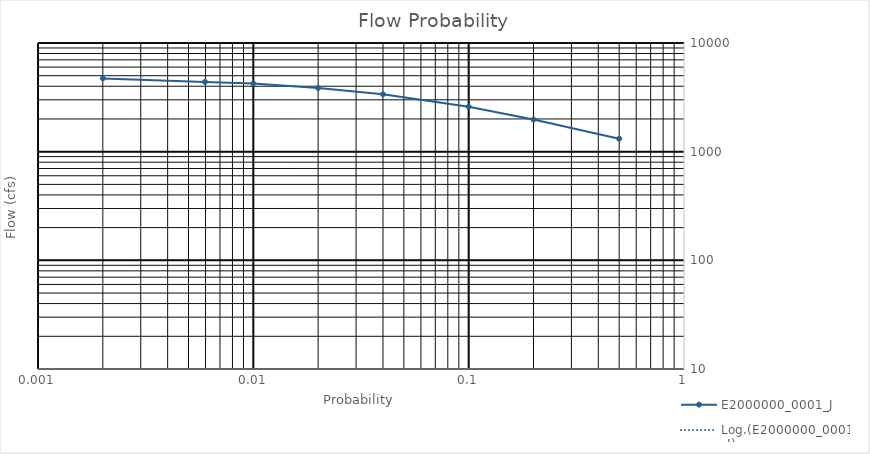
| Category | E2000000_0001_J |
|---|---|
| 0.5 | 1316 |
| 0.2 | 1975.6 |
| 0.1 | 2592 |
| 0.04 | 3374.2 |
| 0.02 | 3849.6 |
| 0.01 | 4230.8 |
| 0.005963207193355748 | 4383.9 |
| 0.002 | 4725.5 |